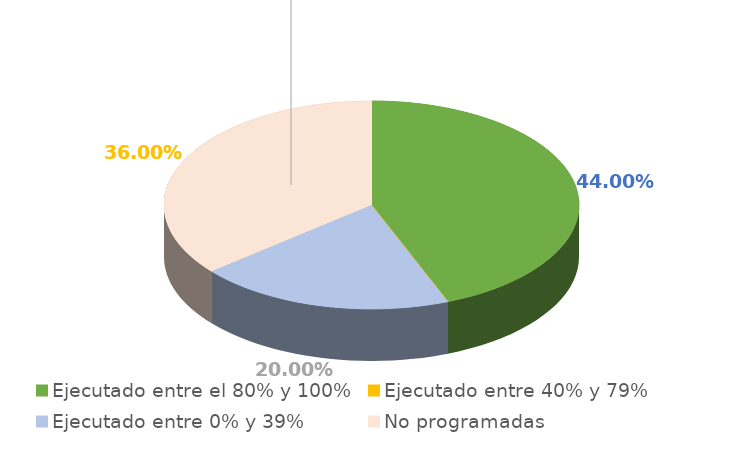
| Category | Series 0 |
|---|---|
| Ejecutado entre el 80% y 100% | 0.44 |
| Ejecutado entre 40% y 79% | 0 |
| Ejecutado entre 0% y 39% | 0.2 |
| No programadas | 0.36 |